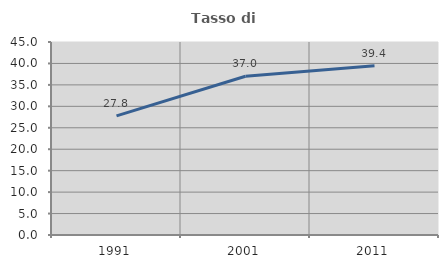
| Category | Tasso di occupazione   |
|---|---|
| 1991.0 | 27.766 |
| 2001.0 | 37.004 |
| 2011.0 | 39.436 |